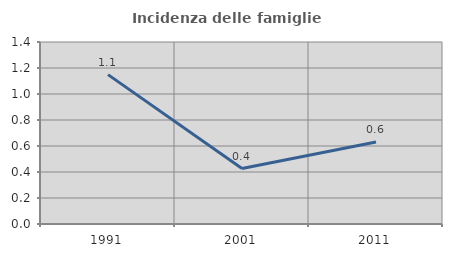
| Category | Incidenza delle famiglie numerose |
|---|---|
| 1991.0 | 1.149 |
| 2001.0 | 0.426 |
| 2011.0 | 0.63 |